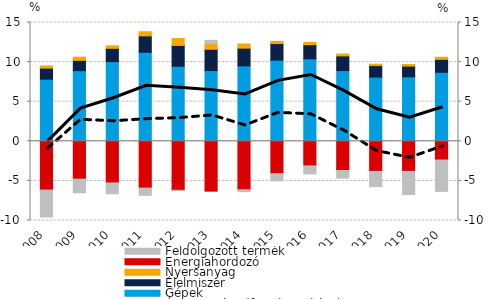
| Category | Gépek | Élelmiszer | Nyersanyag | Energiahordozó | Feldolgozott termék |
|---|---|---|---|---|---|
| 2008.0 | 7.841 | 1.399 | 0.277 | -6.156 | -3.403 |
| 2009.0 | 8.919 | 1.305 | 0.4 | -4.781 | -1.72 |
| 2010.0 | 10.066 | 1.672 | 0.317 | -5.259 | -1.363 |
| 2011.0 | 11.241 | 2.07 | 0.517 | -5.906 | -0.916 |
| 2012.0 | 9.469 | 2.636 | 0.87 | -6.184 | -0.043 |
| 2013.0 | 8.929 | 2.689 | 0.711 | -6.295 | 0.421 |
| 2014.0 | 9.523 | 2.239 | 0.518 | -6.123 | -0.24 |
| 2015.0 | 10.249 | 2.091 | 0.28 | -4.088 | -0.905 |
| 2016.0 | 10.416 | 1.783 | 0.295 | -3.107 | -1.01 |
| 2017.0 | 8.933 | 1.852 | 0.236 | -3.686 | -0.96 |
| 2018.0 | 8.105 | 1.455 | 0.173 | -3.802 | -1.916 |
| 2019.0 | 8.142 | 1.353 | 0.197 | -3.801 | -2.917 |
| 2020.0 | 8.718 | 1.632 | 0.265 | -2.366 | -3.953 |